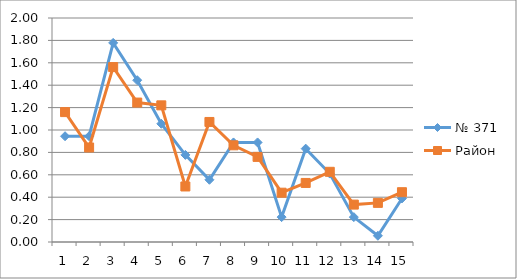
| Category | № 371 | Район |
|---|---|---|
| 0 | 0.944 | 1.16 |
| 1 | 0.944 | 0.844 |
| 2 | 1.778 | 1.562 |
| 3 | 1.444 | 1.245 |
| 4 | 1.056 | 1.22 |
| 5 | 0.778 | 0.496 |
| 6 | 0.556 | 1.072 |
| 7 | 0.889 | 0.863 |
| 8 | 0.889 | 0.76 |
| 9 | 0.222 | 0.44 |
| 10 | 0.833 | 0.527 |
| 11 | 0.611 | 0.627 |
| 12 | 0.222 | 0.334 |
| 13 | 0.056 | 0.349 |
| 14 | 0.389 | 0.445 |